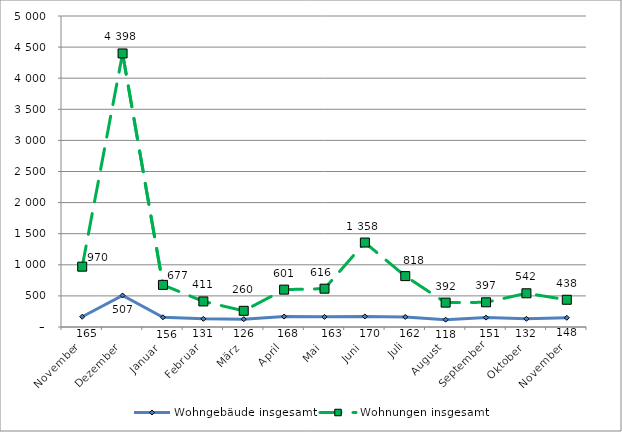
| Category | Wohngebäude insgesamt | Wohnungen insgesamt |
|---|---|---|
| November | 165 | 970 |
| Dezember | 507 | 4398 |
| Januar | 156 | 677 |
| Februar | 131 | 411 |
| März | 126 | 260 |
| April | 168 | 601 |
| Mai | 163 | 616 |
| Juni | 170 | 1358 |
| Juli | 162 | 818 |
| August | 118 | 392 |
| September | 151 | 397 |
| Oktober | 132 | 542 |
| November | 148 | 438 |